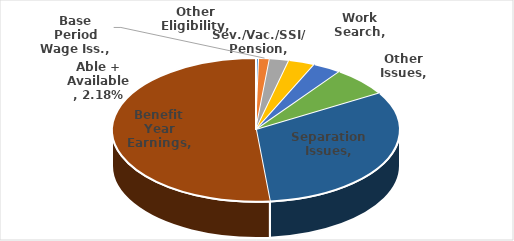
| Category | Series 0 |
|---|---|
| Sev./Vac./SSI/ Pension | 0.003 |
| Base Period Wage Iss. | 0.012 |
| Able + Available | 0.022 |
| Work Search | 0.03 |
| Other Eligibility | 0.032 |
| Other Issues | 0.066 |
| Separation Issues | 0.32 |
| Benefit Year Earnings | 0.515 |